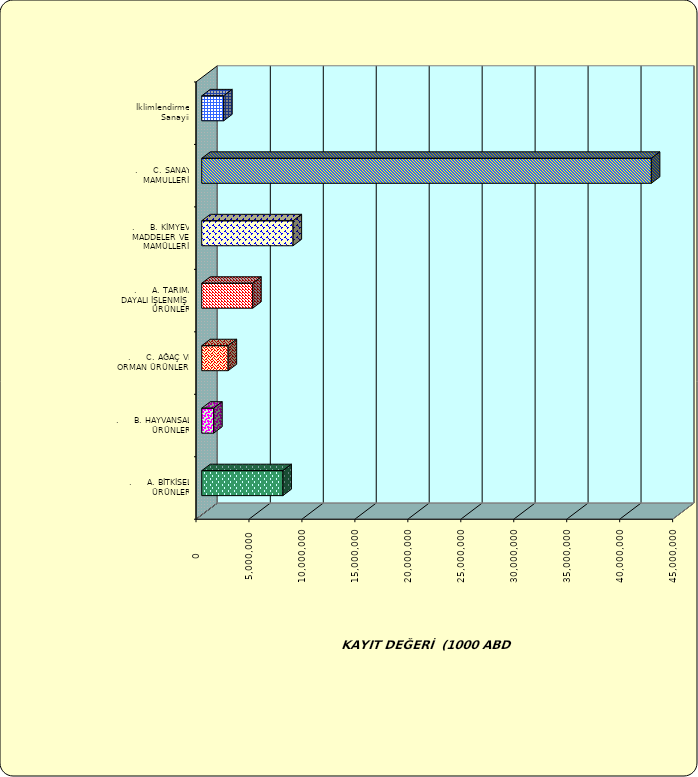
| Category | Series 0 |
|---|---|
| .     A. BİTKİSEL ÜRÜNLER | 7661437.738 |
| .     B. HAYVANSAL ÜRÜNLER | 1129080.145 |
| .     C. AĞAÇ VE ORMAN ÜRÜNLERİ | 2491611.58 |
| .     A. TARIMA DAYALI İŞLENMİŞ ÜRÜNLER | 4811454.585 |
| .     B. KİMYEVİ MADDELER VE MAMÜLLERİ | 8624526.199 |
| .     C. SANAYİ MAMULLERİ | 42448085.216 |
|  İklimlendirme Sanayii | 2070727.689 |